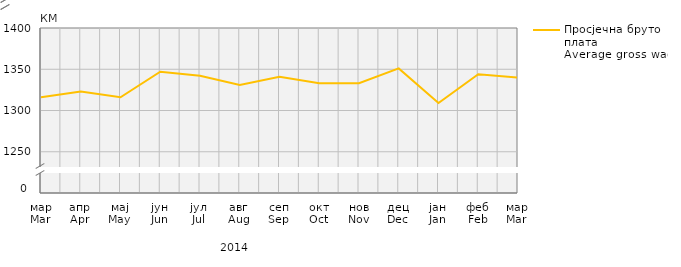
| Category | Просјечна бруто плата
Average gross wage |
|---|---|
| мар
Mar | 1316 |
| апр
Apr | 1323 |
| мај
May | 1316 |
| јун
Jun | 1347 |
| јул
Jul | 1342 |
| авг
Aug | 1331 |
| сеп
Sep | 1341 |
| окт
Oct | 1333 |
| нов
Nov | 1333 |
| дец
Dec | 1351 |
| јан
Jan | 1309 |
| феб
Feb | 1344 |
| мар
Mar | 1340 |